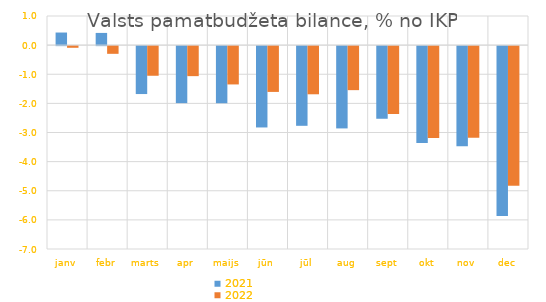
| Category | 2021 | 2022 |
|---|---|---|
| janv | 0.433 | -0.057 |
| febr | 0.419 | -0.264 |
| marts | -1.646 | -1.018 |
| apr | -1.957 | -1.031 |
| maijs | -1.961 | -1.315 |
| jūn | -2.793 | -1.572 |
| jūl | -2.736 | -1.653 |
| aug | -2.825 | -1.511 |
| sept | -2.494 | -2.331 |
| okt | -3.323 | -3.15 |
| nov | -3.434 | -3.144 |
| dec | -5.829 | -4.79 |